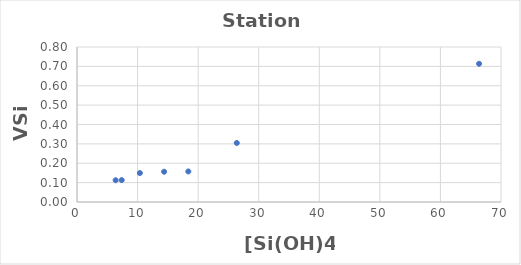
| Category | Series 0 |
|---|---|
| 6.38 | 0.112 |
| 7.38 | 0.113 |
| 10.379999999999999 | 0.15 |
| 14.379999999999999 | 0.156 |
| 18.38 | 0.158 |
| 26.38 | 0.305 |
| 66.38 | 0.713 |